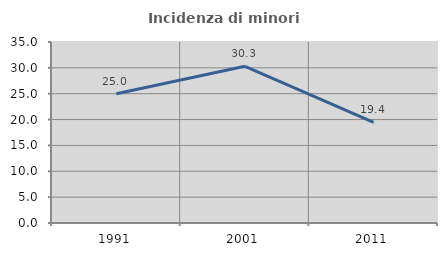
| Category | Incidenza di minori stranieri |
|---|---|
| 1991.0 | 25 |
| 2001.0 | 30.303 |
| 2011.0 | 19.444 |